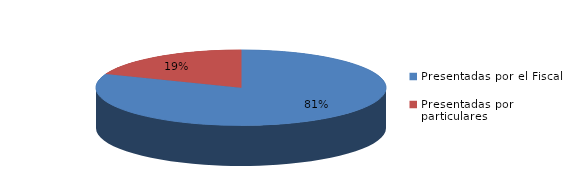
| Category | Series 0 |
|---|---|
| Presentadas por el Fiscal | 140 |
| Presentadas por particulares | 33 |